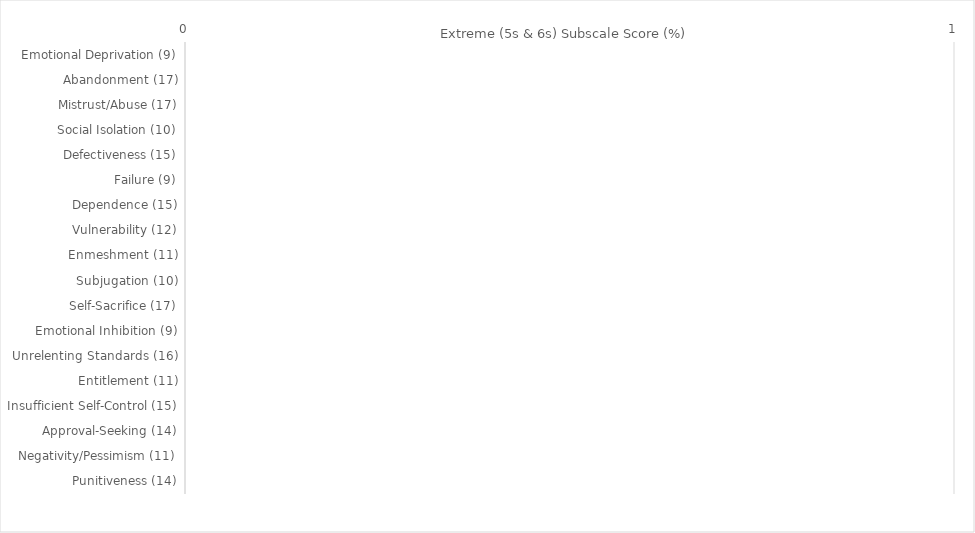
| Category | Series 0 |
|---|---|
| Emotional Deprivation (9) | 0 |
| Abandonment (17) | 0 |
| Mistrust/Abuse (17) | 0 |
| Social Isolation (10) | 0 |
| Defectiveness (15) | 0 |
| Failure (9) | 0 |
| Dependence (15) | 0 |
| Vulnerability (12) | 0 |
| Enmeshment (11) | 0 |
| Subjugation (10) | 0 |
| Self-Sacrifice (17) | 0 |
| Emotional Inhibition (9) | 0 |
| Unrelenting Standards (16) | 0 |
| Entitlement (11) | 0 |
| Insufficient Self-Control (15) | 0 |
| Approval-Seeking (14) | 0 |
| Negativity/Pessimism (11) | 0 |
| Punitiveness (14) | 0 |